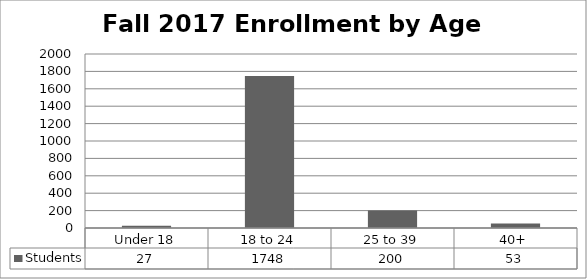
| Category | Students |
|---|---|
| Under 18 | 27 |
| 18 to 24 | 1748 |
| 25 to 39 | 200 |
| 40+ | 53 |